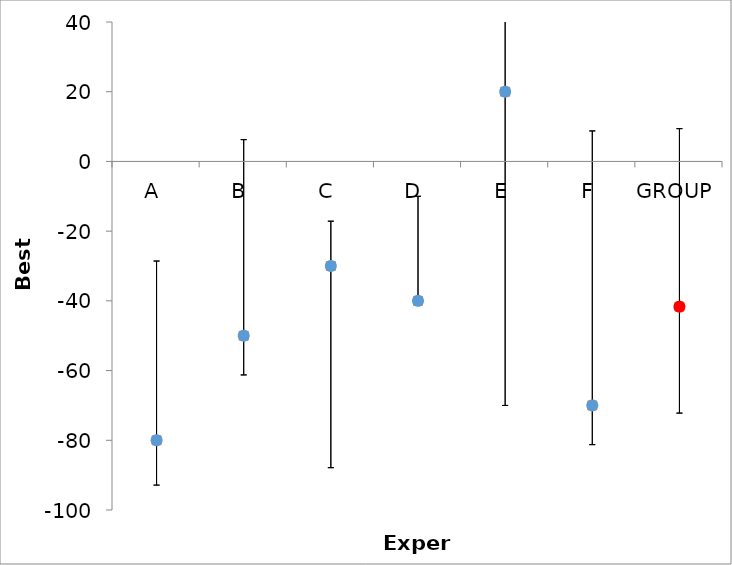
| Category | Series 1 | Series 0 |
|---|---|---|
| A | -80 | -80 |
| B | -50 | -50 |
| C | -30 | -30 |
| D | -40 | -40 |
| E | 20 | 20 |
| F | -70 | -70 |
| GROUP | -41.667 | -41.667 |